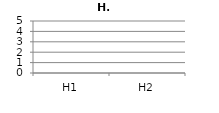
| Category | Gemiddelde |
|---|---|
| H1 | 0 |
| H2 | 0 |